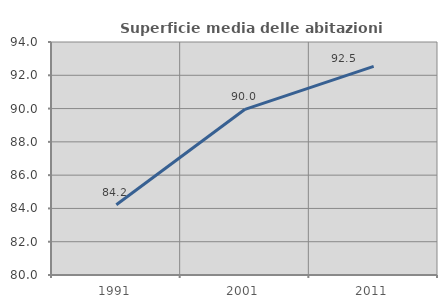
| Category | Superficie media delle abitazioni occupate |
|---|---|
| 1991.0 | 84.22 |
| 2001.0 | 89.956 |
| 2011.0 | 92.537 |